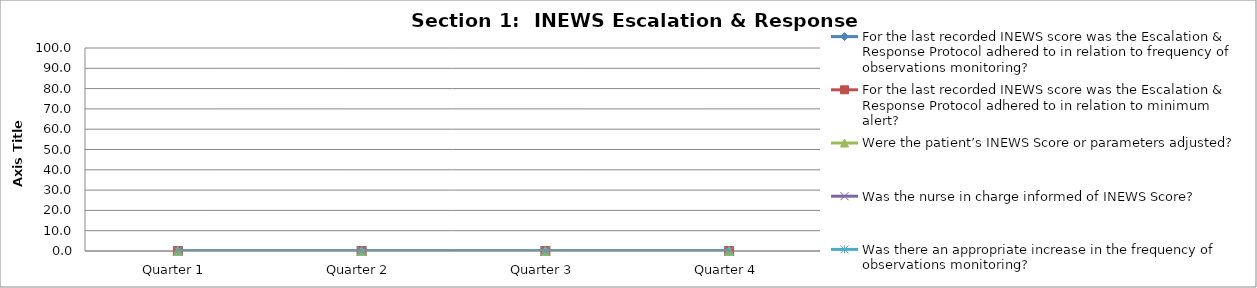
| Category | For the last recorded INEWS score was the Escalation & Response Protocol adhered to in relation to frequency of observations monitoring? | For the last recorded INEWS score was the Escalation & Response Protocol adhered to in relation to minimum alert? | Were the patient’s INEWS Score or parameters adjusted? | Was the nurse in charge informed of INEWS Score? | Was there an appropriate increase in the frequency of observations monitoring? |
|---|---|---|---|---|---|
| Quarter 1 | 0 | 0 | 0 | 0 | 0 |
| Quarter 2 | 0 | 0 | 0 | 0 | 0 |
| Quarter 3 | 0 | 0 | 0 | 0 | 0 |
| Quarter 4 | 0 | 0 | 0 | 0 | 0 |